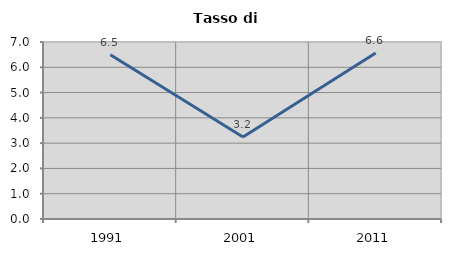
| Category | Tasso di disoccupazione   |
|---|---|
| 1991.0 | 6.497 |
| 2001.0 | 3.241 |
| 2011.0 | 6.564 |